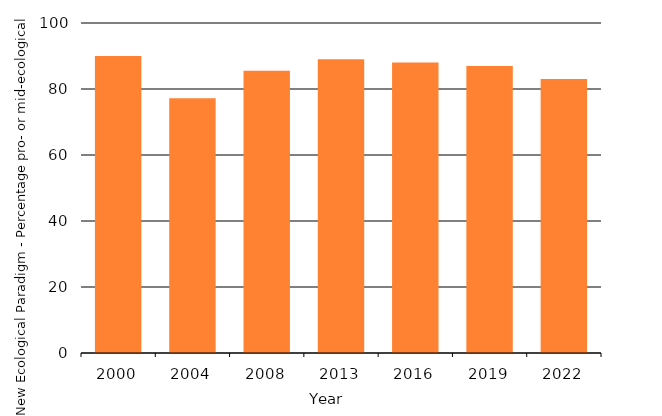
| Category | New Ecological Paradigm - Percentage pro- or mid-ecological |
|---|---|
| 2000.0 | 90 |
| 2004.0 | 77.22 |
| 2008.0 | 85.5 |
| 2013.0 | 89 |
| 2016.0 | 88 |
| 2019.0 | 87 |
| 2022.0 | 83 |